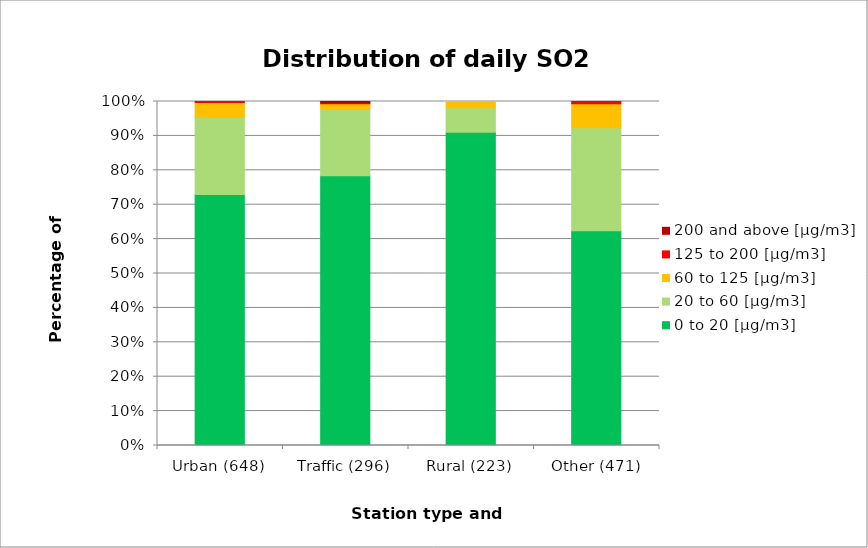
| Category | 0 to 20 [µg/m3] | 20 to 60 [µg/m3] | 60 to 125 [µg/m3] | 125 to 200 [µg/m3] | 200 and above [µg/m3] |
|---|---|---|---|---|---|
| Urban (648) | 0.73 | 0.224 | 0.043 | 0.003 | 0 |
| Traffic (296) | 0.784 | 0.193 | 0.017 | 0.003 | 0.003 |
| Rural (223) | 0.91 | 0.072 | 0.018 | 0 | 0 |
| Other (471) | 0.624 | 0.299 | 0.07 | 0.006 | 0 |